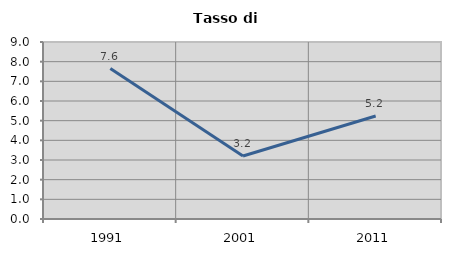
| Category | Tasso di disoccupazione   |
|---|---|
| 1991.0 | 7.647 |
| 2001.0 | 3.206 |
| 2011.0 | 5.234 |